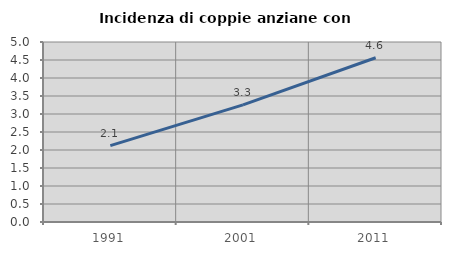
| Category | Incidenza di coppie anziane con figli |
|---|---|
| 1991.0 | 2.123 |
| 2001.0 | 3.254 |
| 2011.0 | 4.563 |